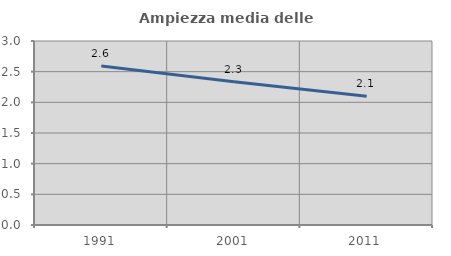
| Category | Ampiezza media delle famiglie |
|---|---|
| 1991.0 | 2.592 |
| 2001.0 | 2.336 |
| 2011.0 | 2.1 |